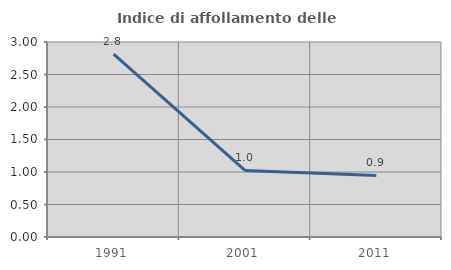
| Category | Indice di affollamento delle abitazioni  |
|---|---|
| 1991.0 | 2.815 |
| 2001.0 | 1.024 |
| 2011.0 | 0.948 |